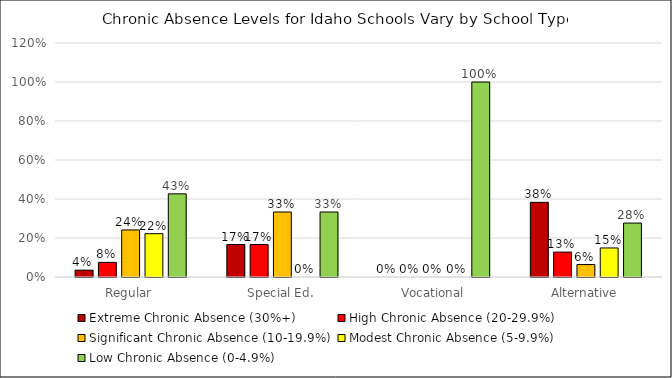
| Category | Extreme Chronic Absence (30%+) | High Chronic Absence (20-29.9%) | Significant Chronic Absence (10-19.9%) | Modest Chronic Absence (5-9.9%) | Low Chronic Absence (0-4.9%) |
|---|---|---|---|---|---|
| Regular | 0.035 | 0.075 | 0.241 | 0.222 | 0.427 |
| Special Ed. | 0.167 | 0.167 | 0.333 | 0 | 0.333 |
| Vocational | 0 | 0 | 0 | 0 | 1 |
| Alternative | 0.383 | 0.128 | 0.064 | 0.149 | 0.277 |